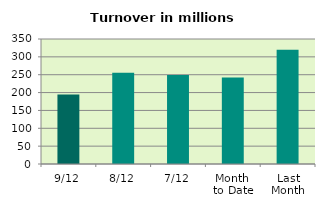
| Category | Series 0 |
|---|---|
| 9/12 | 194.322 |
| 8/12 | 255.316 |
| 7/12 | 249.544 |
| Month 
to Date | 242.165 |
| Last
Month | 319.611 |